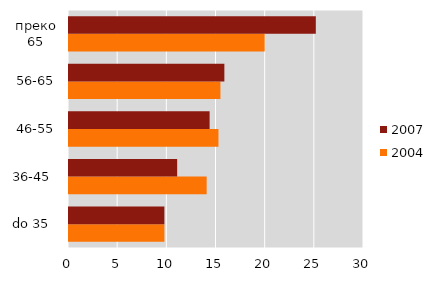
| Category | 2004 | 2007 |
|---|---|---|
| do 35  | 9.7 | 9.7 |
| 36-45  | 14 | 11 |
| 46-55 | 15.2 | 14.3 |
| 56-65 | 15.4 | 15.8 |
| преко 65 | 19.9 | 25.1 |